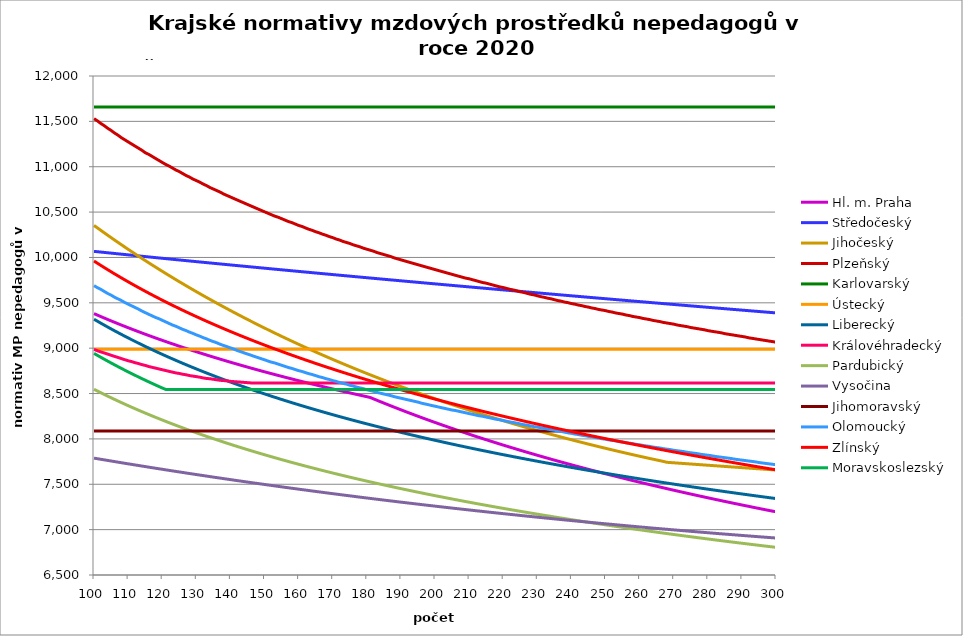
| Category | Hl. m. Praha | Středočeský | Jihočeský | Plzeňský | Karlovarský  | Ústecký   | Liberecký | Královéhradecký | Pardubický | Vysočina | Jihomoravský | Olomoucký | Zlínský | Moravskoslezský |
|---|---|---|---|---|---|---|---|---|---|---|---|---|---|---|
| 100.0 | 9380.95 | 10067.092 | 10352.976 | 11529.56 | 11657.998 | 8987.069 | 9319.242 | 8987.322 | 8546.521 | 7788.071 | 8087.211 | 9689.531 | 9960.602 | 8942.705 |
| 101.0 | 9364.603 | 10063.216 | 10325.74 | 11505.439 | 11657.998 | 8987.069 | 9297.355 | 8971.784 | 8527.436 | 7781.943 | 8087.211 | 9666.875 | 9936.397 | 8921.024 |
| 102.0 | 9348.45 | 10059.349 | 10298.725 | 11476.628 | 11657.998 | 8987.069 | 9275.775 | 8959.392 | 8508.615 | 7775.606 | 8087.211 | 9648.075 | 9912.513 | 8899.66 |
| 103.0 | 9332.488 | 10055.489 | 10271.928 | 11452.728 | 11657.998 | 8987.069 | 9254.495 | 8947.034 | 8490.052 | 7769.062 | 8087.211 | 9625.611 | 9888.94 | 8878.605 |
| 104.0 | 9316.712 | 10051.638 | 10245.346 | 11424.179 | 11657.998 | 8987.069 | 9233.508 | 8934.711 | 8471.739 | 7762.965 | 8087.211 | 9603.252 | 9865.673 | 8857.852 |
| 105.0 | 9301.118 | 10047.795 | 10218.978 | 11400.498 | 11657.998 | 8987.069 | 9212.806 | 8922.421 | 8453.671 | 7756.659 | 8087.211 | 9584.699 | 9842.703 | 8837.393 |
| 106.0 | 9285.703 | 10043.959 | 10192.822 | 11372.208 | 11657.998 | 8987.069 | 9192.382 | 8910.165 | 8435.843 | 7750.364 | 8087.211 | 9562.529 | 9820.024 | 8817.22 |
| 107.0 | 9270.462 | 10040.132 | 10166.875 | 11348.741 | 11657.998 | 8987.069 | 9172.231 | 8897.942 | 8418.248 | 7744.079 | 8087.211 | 9544.132 | 9797.628 | 8797.327 |
| 108.0 | 9255.392 | 10036.311 | 10141.134 | 11320.708 | 11657.998 | 8987.069 | 9152.345 | 8885.753 | 8400.882 | 7738.02 | 8087.211 | 9525.806 | 9775.511 | 8777.708 |
| 109.0 | 9240.489 | 10032.499 | 10115.598 | 11297.453 | 11657.998 | 8987.069 | 9132.719 | 8873.598 | 8383.739 | 7731.539 | 8087.211 | 9503.908 | 9753.664 | 8758.356 |
| 110.0 | 9225.749 | 10028.693 | 10090.266 | 11274.293 | 11657.998 | 8987.069 | 9113.346 | 8861.475 | 8366.814 | 7725.5 | 8087.211 | 9485.736 | 9732.083 | 8739.265 |
| 111.0 | 9211.169 | 10024.896 | 10065.133 | 11251.227 | 11657.998 | 8987.069 | 9094.222 | 8852.405 | 8350.102 | 7719.47 | 8087.211 | 9467.634 | 9710.761 | 8720.428 |
| 112.0 | 9196.746 | 10021.105 | 10040.2 | 11228.256 | 11657.998 | 8987.069 | 9075.339 | 8840.341 | 8333.598 | 7713.45 | 8087.211 | 9449.6 | 9689.692 | 8701.84 |
| 113.0 | 9182.477 | 10017.321 | 10015.462 | 11205.379 | 11657.998 | 8987.069 | 9056.694 | 8831.314 | 8317.298 | 7707.225 | 8087.211 | 9431.635 | 9668.872 | 8683.495 |
| 114.0 | 9168.358 | 10013.545 | 9990.92 | 11182.595 | 11657.998 | 8987.069 | 9038.28 | 8819.307 | 8301.198 | 7701.224 | 8087.211 | 9410.167 | 9648.294 | 8665.388 |
| 115.0 | 9154.386 | 10009.775 | 9966.57 | 11155.375 | 11657.998 | 8987.069 | 9020.093 | 8810.323 | 8285.293 | 7695.232 | 8087.211 | 9392.351 | 9627.953 | 8647.514 |
| 116.0 | 9140.559 | 10006.013 | 9942.41 | 11137.303 | 11657.998 | 8987.069 | 9002.128 | 8798.372 | 8269.579 | 7689.249 | 8087.211 | 9374.603 | 9607.845 | 8629.867 |
| 117.0 | 9126.873 | 10002.257 | 9918.44 | 11114.794 | 11657.998 | 8987.069 | 8984.38 | 8789.431 | 8254.051 | 7683.063 | 8087.211 | 9356.922 | 9587.964 | 8612.443 |
| 118.0 | 9113.326 | 9998.507 | 9894.656 | 11092.376 | 11657.998 | 8987.069 | 8966.844 | 8780.508 | 8238.707 | 7677.099 | 8087.211 | 9339.307 | 9568.307 | 8595.236 |
| 119.0 | 9099.915 | 9994.765 | 9871.057 | 11070.048 | 11657.998 | 8987.069 | 8949.516 | 8771.602 | 8223.541 | 7671.145 | 8087.211 | 9325.263 | 9548.867 | 8578.242 |
| 120.0 | 9086.638 | 9991.029 | 9847.642 | 11047.81 | 11657.998 | 8987.069 | 8932.392 | 8762.715 | 8208.552 | 7665.412 | 8087.211 | 9307.767 | 9529.641 | 8561.456 |
| 121.0 | 9073.491 | 9987.299 | 9824.408 | 11025.662 | 11657.998 | 8987.069 | 8915.467 | 8753.846 | 8193.733 | 7659.264 | 8087.211 | 9290.337 | 9510.625 | 8545.876 |
| 122.0 | 9060.473 | 9983.576 | 9801.353 | 11008.006 | 11657.998 | 8987.069 | 8898.737 | 8744.995 | 8179.084 | 7653.337 | 8087.211 | 9272.972 | 9491.813 | 8545.876 |
| 123.0 | 9047.581 | 9979.86 | 9778.477 | 10986.017 | 11657.998 | 8987.069 | 8882.199 | 8736.162 | 8164.599 | 7647.631 | 8087.211 | 9255.672 | 9473.203 | 8545.876 |
| 124.0 | 9034.812 | 9976.149 | 9755.776 | 10964.115 | 11657.998 | 8987.069 | 8865.848 | 8727.346 | 8150.276 | 7641.722 | 8087.211 | 9241.878 | 9454.79 | 8545.876 |
| 125.0 | 9022.165 | 9972.445 | 9733.25 | 10946.656 | 11657.998 | 8987.069 | 8849.68 | 8721.479 | 8136.111 | 7636.033 | 8087.211 | 9224.693 | 9436.57 | 8545.876 |
| 126.0 | 9009.637 | 9968.747 | 9710.896 | 10924.911 | 11657.998 | 8987.069 | 8833.693 | 8712.693 | 8122.102 | 7630.352 | 8087.211 | 9207.572 | 9418.54 | 8545.876 |
| 127.0 | 8997.226 | 9965.055 | 9688.714 | 10903.251 | 11657.998 | 8987.069 | 8817.883 | 8706.846 | 8108.245 | 7624.26 | 8087.211 | 9193.921 | 9400.696 | 8545.876 |
| 128.0 | 8984.93 | 9961.369 | 9666.701 | 10885.986 | 11657.998 | 8987.069 | 8802.245 | 8698.089 | 8094.538 | 7618.597 | 8087.211 | 9176.915 | 9383.034 | 8545.876 |
| 129.0 | 8972.747 | 9957.689 | 9644.856 | 10864.48 | 11657.998 | 8987.069 | 8786.777 | 8692.261 | 8080.977 | 7612.942 | 8087.211 | 9163.354 | 9365.55 | 8545.876 |
| 130.0 | 8960.675 | 9954.015 | 9623.177 | 10847.337 | 11657.998 | 8987.069 | 8771.476 | 8686.441 | 8067.56 | 7607.296 | 8087.211 | 9146.46 | 9348.243 | 8545.876 |
| 131.0 | 8948.711 | 9950.346 | 9601.663 | 10830.248 | 11657.998 | 8987.069 | 8756.338 | 8680.629 | 8054.283 | 7601.658 | 8087.211 | 9132.99 | 9331.107 | 8545.876 |
| 132.0 | 8936.855 | 9946.684 | 9580.311 | 10808.962 | 11657.998 | 8987.069 | 8741.36 | 8671.925 | 8041.146 | 7596.028 | 8087.211 | 9116.207 | 9314.141 | 8545.876 |
| 133.0 | 8925.103 | 9943.027 | 9559.122 | 10791.994 | 11657.998 | 8987.069 | 8726.539 | 8666.132 | 8028.144 | 7590.407 | 8087.211 | 9102.826 | 9297.34 | 8545.876 |
| 134.0 | 8913.455 | 9939.376 | 9538.092 | 10770.858 | 11657.998 | 8987.069 | 8711.873 | 8663.239 | 8015.275 | 7584.586 | 8087.211 | 9086.154 | 9280.703 | 8545.876 |
| 135.0 | 8901.909 | 9935.731 | 9517.221 | 10754.009 | 11657.998 | 8987.069 | 8697.358 | 8657.457 | 8002.538 | 7578.982 | 8087.211 | 9072.86 | 9264.225 | 8545.876 |
| 136.0 | 8890.462 | 9932.091 | 9496.507 | 10737.212 | 11657.998 | 8987.069 | 8682.991 | 8651.684 | 7989.928 | 7573.386 | 8087.211 | 9059.606 | 9247.904 | 8545.876 |
| 137.0 | 8879.113 | 9928.456 | 9475.948 | 10720.468 | 11657.998 | 8987.069 | 8668.771 | 8645.918 | 7977.446 | 7568.005 | 8087.211 | 9043.092 | 9231.738 | 8545.876 |
| 138.0 | 8867.861 | 9924.827 | 9455.544 | 10699.611 | 11657.998 | 8987.069 | 8654.694 | 8643.038 | 7965.087 | 7562.425 | 8087.211 | 9029.924 | 9215.724 | 8545.876 |
| 139.0 | 8856.704 | 9921.204 | 9435.292 | 10682.984 | 11657.998 | 8987.069 | 8640.758 | 8640.16 | 7952.85 | 7556.853 | 8087.211 | 9016.794 | 9199.858 | 8545.876 |
| 140.0 | 8845.64 | 9917.585 | 9415.192 | 10666.408 | 11657.998 | 8987.069 | 8626.96 | 8634.409 | 7940.732 | 7551.496 | 8087.211 | 9003.702 | 9184.139 | 8545.876 |
| 141.0 | 8834.668 | 9913.973 | 9395.242 | 10649.884 | 11657.998 | 8987.069 | 8613.298 | 8631.537 | 7928.732 | 7545.94 | 8087.211 | 8990.649 | 9168.563 | 8545.876 |
| 142.0 | 8823.786 | 9910.365 | 9375.44 | 10633.411 | 11657.998 | 8987.069 | 8599.77 | 8628.666 | 7916.848 | 7540.598 | 8087.211 | 8974.385 | 9153.129 | 8545.876 |
| 143.0 | 8812.994 | 9906.763 | 9355.786 | 10616.988 | 11657.998 | 8987.069 | 8586.373 | 8625.798 | 7905.077 | 7535.263 | 8087.211 | 8961.416 | 9137.834 | 8545.876 |
| 144.0 | 8802.288 | 9903.165 | 9336.278 | 10600.617 | 11657.998 | 8987.069 | 8573.104 | 8622.931 | 7893.418 | 7529.732 | 8087.211 | 8948.485 | 9122.676 | 8545.876 |
| 145.0 | 8791.669 | 9899.573 | 9316.914 | 10584.296 | 11657.998 | 8987.069 | 8559.962 | 8620.066 | 7881.868 | 7524.412 | 8087.211 | 8935.591 | 9107.652 | 8545.876 |
| 146.0 | 8781.135 | 9895.986 | 9297.694 | 10568.025 | 11657.998 | 8987.069 | 8546.945 | 8617.204 | 7870.427 | 7519.101 | 8087.211 | 8922.734 | 9092.76 | 8545.876 |
| 147.0 | 8770.684 | 9892.404 | 9278.615 | 10551.804 | 11657.998 | 8987.069 | 8534.05 | 8617.204 | 7859.091 | 7513.797 | 8087.211 | 8909.914 | 9077.998 | 8545.876 |
| 148.0 | 8760.315 | 9888.827 | 9259.678 | 10535.632 | 11657.998 | 8987.069 | 8521.276 | 8617.204 | 7847.86 | 7508.5 | 8087.211 | 8897.131 | 9063.364 | 8545.876 |
| 149.0 | 8750.027 | 9885.255 | 9240.88 | 10519.51 | 11657.998 | 8987.069 | 8508.62 | 8617.204 | 7836.731 | 7503.211 | 8087.211 | 8884.384 | 9048.856 | 8545.876 |
| 150.0 | 8739.819 | 9881.688 | 9222.22 | 10503.438 | 11657.998 | 8987.069 | 8496.081 | 8617.204 | 7825.703 | 7497.929 | 8087.211 | 8871.674 | 9034.471 | 8545.876 |
| 151.0 | 8729.689 | 9878.126 | 9203.698 | 10487.414 | 11657.998 | 8987.069 | 8483.656 | 8617.204 | 7814.775 | 7492.654 | 8087.211 | 8859 | 9020.208 | 8545.876 |
| 152.0 | 8719.636 | 9874.569 | 9185.311 | 10471.439 | 11657.998 | 8987.069 | 8471.343 | 8617.204 | 7803.944 | 7487.387 | 8087.211 | 8846.362 | 9006.065 | 8545.876 |
| 153.0 | 8709.66 | 9871.016 | 9167.06 | 10455.513 | 11657.998 | 8987.069 | 8459.142 | 8617.204 | 7793.209 | 7482.128 | 8087.211 | 8836.908 | 8992.039 | 8545.876 |
| 154.0 | 8699.758 | 9867.469 | 9148.941 | 10443.6 | 11657.998 | 8987.069 | 8447.05 | 8617.204 | 7782.569 | 7476.876 | 8087.211 | 8824.333 | 8978.13 | 8545.876 |
| 155.0 | 8689.93 | 9863.926 | 9130.956 | 10427.759 | 11657.998 | 8987.069 | 8435.064 | 8617.204 | 7772.022 | 7471.833 | 8087.211 | 8811.794 | 8964.335 | 8545.876 |
| 156.0 | 8680.175 | 9860.387 | 9113.101 | 10411.965 | 11657.998 | 8987.069 | 8423.185 | 8617.204 | 7761.567 | 7466.595 | 8087.211 | 8799.291 | 8950.653 | 8545.876 |
| 157.0 | 8670.492 | 9856.854 | 9095.377 | 10396.219 | 11657.998 | 8987.069 | 8411.41 | 8617.204 | 7751.202 | 7461.364 | 8087.211 | 8786.823 | 8937.081 | 8545.876 |
| 158.0 | 8660.879 | 9853.325 | 9077.782 | 10384.441 | 11657.998 | 8987.069 | 8399.737 | 8617.204 | 7740.925 | 7456.342 | 8087.211 | 8777.495 | 8923.618 | 8545.876 |
| 159.0 | 8651.336 | 9849.8 | 9060.314 | 10368.778 | 11657.998 | 8987.069 | 8388.164 | 8617.204 | 7730.736 | 7451.326 | 8087.211 | 8765.088 | 8910.263 | 8545.876 |
| 160.0 | 8641.862 | 9846.281 | 9042.974 | 10353.163 | 11657.998 | 8987.069 | 8376.691 | 8617.204 | 7720.634 | 7446.117 | 8087.211 | 8752.717 | 8897.013 | 8545.876 |
| 161.0 | 8632.455 | 9842.765 | 9025.759 | 10341.482 | 11657.998 | 8987.069 | 8365.316 | 8617.204 | 7710.615 | 7441.116 | 8087.211 | 8743.461 | 8883.868 | 8545.876 |
| 162.0 | 8623.115 | 9839.255 | 9008.669 | 10325.948 | 11657.998 | 8987.069 | 8354.036 | 8617.204 | 7700.681 | 7436.32 | 8087.211 | 8731.151 | 8870.825 | 8545.876 |
| 163.0 | 8613.841 | 9835.748 | 8991.703 | 10310.461 | 11657.998 | 8987.069 | 8342.852 | 8617.204 | 7690.829 | 7431.132 | 8087.211 | 8718.875 | 8857.884 | 8545.876 |
| 164.0 | 8604.631 | 9832.246 | 8974.859 | 10298.876 | 11657.998 | 8987.069 | 8331.761 | 8617.204 | 7681.057 | 7426.15 | 8087.211 | 8709.691 | 8845.042 | 8545.876 |
| 165.0 | 8595.486 | 9828.749 | 8958.137 | 10283.47 | 11657.998 | 8987.069 | 8320.761 | 8617.204 | 7671.366 | 7421.175 | 8087.211 | 8697.475 | 8832.298 | 8545.876 |
| 166.0 | 8586.404 | 9825.256 | 8941.536 | 10271.946 | 11657.998 | 8987.069 | 8309.852 | 8617.204 | 7661.753 | 7416.207 | 8087.211 | 8685.294 | 8819.651 | 8545.876 |
| 167.0 | 8577.384 | 9821.767 | 8925.055 | 10256.621 | 11657.998 | 8987.069 | 8299.033 | 8617.204 | 7652.218 | 7411.245 | 8087.211 | 8676.18 | 8807.1 | 8545.876 |
| 168.0 | 8568.425 | 9818.283 | 8908.692 | 10245.156 | 11657.998 | 8987.069 | 8288.301 | 8617.204 | 7642.759 | 7406.29 | 8087.211 | 8664.059 | 8794.642 | 8545.876 |
| 169.0 | 8559.527 | 9814.803 | 8892.446 | 10229.911 | 11657.998 | 8987.069 | 8277.656 | 8617.204 | 7633.376 | 7401.342 | 8087.211 | 8654.99 | 8782.277 | 8545.876 |
| 170.0 | 8550.689 | 9811.327 | 8876.318 | 10218.506 | 11657.998 | 8987.069 | 8267.097 | 8617.204 | 7624.067 | 7396.597 | 8087.211 | 8642.927 | 8770.004 | 8545.876 |
| 171.0 | 8541.91 | 9807.855 | 8860.305 | 10203.34 | 11657.998 | 8987.069 | 8256.621 | 8617.204 | 7614.83 | 7391.859 | 8087.211 | 8633.902 | 8757.82 | 8545.876 |
| 172.0 | 8533.188 | 9804.388 | 8844.407 | 10191.994 | 11657.998 | 8987.069 | 8246.229 | 8617.204 | 7605.666 | 7386.93 | 8087.211 | 8621.898 | 8745.726 | 8545.876 |
| 173.0 | 8524.525 | 9800.925 | 8828.623 | 10176.906 | 11657.998 | 8987.069 | 8235.918 | 8617.204 | 7596.574 | 7382.007 | 8087.211 | 8612.917 | 8733.719 | 8545.876 |
| 174.0 | 8515.917 | 9797.466 | 8812.952 | 10165.619 | 11657.998 | 8987.069 | 8225.688 | 8617.204 | 7587.551 | 7377.288 | 8087.211 | 8603.954 | 8721.798 | 8545.876 |
| 175.0 | 8507.366 | 9794.011 | 8797.393 | 10154.357 | 11657.998 | 8987.069 | 8215.537 | 8617.204 | 7578.597 | 7372.574 | 8087.211 | 8592.033 | 8709.963 | 8545.876 |
| 176.0 | 8498.87 | 9790.56 | 8781.946 | 10139.381 | 11657.998 | 8987.069 | 8205.465 | 8617.204 | 7569.712 | 7367.867 | 8087.211 | 8583.114 | 8698.211 | 8545.876 |
| 177.0 | 8490.429 | 9787.113 | 8766.608 | 10128.177 | 11657.998 | 8987.069 | 8195.47 | 8617.204 | 7560.893 | 7362.969 | 8087.211 | 8571.251 | 8686.543 | 8545.876 |
| 178.0 | 8482.041 | 9783.67 | 8751.381 | 10116.998 | 11657.998 | 8987.069 | 8185.552 | 8617.204 | 7552.141 | 7358.274 | 8087.211 | 8562.375 | 8674.956 | 8545.876 |
| 179.0 | 8473.707 | 9780.232 | 8736.261 | 10102.131 | 11657.998 | 8987.069 | 8175.708 | 8617.204 | 7543.455 | 7353.585 | 8087.211 | 8553.517 | 8663.45 | 8545.876 |
| 180.0 | 8465.424 | 9776.797 | 8721.25 | 10091.009 | 11657.998 | 8987.069 | 8165.939 | 8617.204 | 7534.833 | 7348.901 | 8087.211 | 8541.736 | 8652.024 | 8545.876 |
| 181.0 | 8456.47 | 9773.367 | 8706.345 | 10079.912 | 11657.998 | 8987.069 | 8156.242 | 8617.204 | 7526.275 | 7344.224 | 8087.211 | 8532.921 | 8640.676 | 8545.876 |
| 182.0 | 8440.899 | 9769.94 | 8691.547 | 10068.839 | 11657.998 | 8987.069 | 8146.618 | 8617.204 | 7517.779 | 7339.553 | 8087.211 | 8524.124 | 8629.406 | 8545.876 |
| 183.0 | 8425.46 | 9766.517 | 8676.853 | 10054.113 | 11657.998 | 8987.069 | 8137.065 | 8617.204 | 7509.346 | 7334.887 | 8087.211 | 8512.423 | 8618.212 | 8545.876 |
| 184.0 | 8410.151 | 9763.098 | 8662.265 | 10043.097 | 11657.998 | 8987.069 | 8127.583 | 8617.204 | 7500.973 | 7330.422 | 8087.211 | 8503.668 | 8607.094 | 8545.876 |
| 185.0 | 8394.971 | 9759.683 | 8647.779 | 10032.105 | 11657.998 | 8987.069 | 8118.169 | 8617.204 | 7492.661 | 7325.768 | 8087.211 | 8494.932 | 8596.05 | 8545.876 |
| 186.0 | 8379.917 | 9756.272 | 8633.397 | 10021.137 | 11657.998 | 8987.069 | 8108.824 | 8617.204 | 7484.409 | 7321.12 | 8087.211 | 8486.213 | 8585.08 | 8545.876 |
| 187.0 | 8364.987 | 9752.865 | 8619.117 | 10010.193 | 11657.998 | 8987.069 | 8099.547 | 8617.204 | 7476.215 | 7316.671 | 8087.211 | 8477.512 | 8574.183 | 8545.876 |
| 188.0 | 8350.18 | 9749.462 | 8604.938 | 9995.638 | 11657.998 | 8987.069 | 8090.336 | 8617.204 | 7468.08 | 7312.228 | 8087.211 | 8465.939 | 8563.357 | 8545.876 |
| 189.0 | 8335.495 | 9746.062 | 8590.859 | 9984.749 | 11657.998 | 8987.069 | 8081.191 | 8617.204 | 7460.001 | 7307.597 | 8087.211 | 8457.279 | 8552.602 | 8545.876 |
| 190.0 | 8320.928 | 9742.666 | 8576.881 | 9973.885 | 11657.998 | 8987.069 | 8072.111 | 8617.204 | 7451.98 | 7302.972 | 8087.211 | 8448.638 | 8541.918 | 8545.876 |
| 191.0 | 8306.479 | 9739.274 | 8563.001 | 9963.043 | 11657.998 | 8987.069 | 8063.095 | 8617.204 | 7444.014 | 7298.738 | 8087.211 | 8440.014 | 8531.302 | 8545.876 |
| 192.0 | 8292.146 | 9735.886 | 8549.22 | 9952.226 | 11657.998 | 8987.069 | 8054.142 | 8617.204 | 7436.103 | 7294.124 | 8087.211 | 8431.407 | 8520.754 | 8545.876 |
| 193.0 | 8277.928 | 9732.501 | 8535.536 | 9941.432 | 11657.998 | 8987.069 | 8045.252 | 8617.204 | 7428.247 | 7289.9 | 8087.211 | 8422.818 | 8510.274 | 8545.876 |
| 194.0 | 8263.822 | 9729.121 | 8521.949 | 9930.661 | 11657.998 | 8987.069 | 8036.423 | 8617.204 | 7420.444 | 7285.297 | 8087.211 | 8414.247 | 8499.861 | 8545.876 |
| 195.0 | 8249.828 | 9725.743 | 8508.458 | 9919.913 | 11657.998 | 8987.069 | 8027.656 | 8617.204 | 7412.695 | 7280.892 | 8087.211 | 8405.693 | 8489.513 | 8545.876 |
| 196.0 | 8235.943 | 9722.37 | 8495.063 | 9909.189 | 11657.998 | 8987.069 | 8018.948 | 8617.204 | 7404.998 | 7276.301 | 8087.211 | 8394.315 | 8479.23 | 8545.876 |
| 197.0 | 8222.166 | 9719 | 8481.762 | 9898.488 | 11657.998 | 8987.069 | 8010.3 | 8617.204 | 7397.353 | 7272.097 | 8087.211 | 8385.801 | 8469.011 | 8545.876 |
| 198.0 | 8208.496 | 9715.634 | 8468.555 | 9887.81 | 11657.998 | 8987.069 | 8001.711 | 8617.204 | 7389.759 | 7267.708 | 8087.211 | 8377.305 | 8458.856 | 8545.876 |
| 199.0 | 8194.931 | 9712.271 | 8455.441 | 9877.155 | 11657.998 | 8987.069 | 7993.179 | 8617.204 | 7382.216 | 7263.514 | 8087.211 | 8368.826 | 8448.763 | 8545.876 |
| 200.0 | 8181.47 | 9708.912 | 8442.421 | 9866.523 | 11657.998 | 8987.069 | 7984.705 | 8617.204 | 7374.722 | 7259.135 | 8087.211 | 8360.364 | 8438.732 | 8545.876 |
| 201.0 | 8168.111 | 9705.557 | 8429.492 | 9855.914 | 11657.998 | 8987.069 | 7976.287 | 8617.204 | 7367.278 | 7254.761 | 8087.211 | 8351.919 | 8428.762 | 8545.876 |
| 202.0 | 8154.854 | 9702.205 | 8416.654 | 9845.328 | 11657.998 | 8987.069 | 7967.925 | 8617.204 | 7359.883 | 7250.583 | 8087.211 | 8343.491 | 8418.853 | 8545.876 |
| 203.0 | 8141.696 | 9698.857 | 8403.907 | 9834.764 | 11657.998 | 8987.069 | 7959.619 | 8617.204 | 7352.535 | 7246.219 | 8087.211 | 8335.081 | 8409.003 | 8545.876 |
| 204.0 | 8128.637 | 9695.512 | 8391.251 | 9824.223 | 11657.998 | 8987.069 | 7951.366 | 8617.204 | 7345.236 | 7242.05 | 8087.211 | 8326.687 | 8399.213 | 8545.876 |
| 205.0 | 8115.675 | 9692.171 | 8378.683 | 9813.704 | 11657.998 | 8987.069 | 7943.168 | 8617.204 | 7337.983 | 7237.697 | 8087.211 | 8318.31 | 8389.481 | 8545.876 |
| 206.0 | 8102.808 | 9688.833 | 8366.204 | 9803.209 | 11657.998 | 8987.069 | 7935.023 | 8617.204 | 7330.777 | 7233.349 | 8087.211 | 8312.735 | 8379.806 | 8545.876 |
| 207.0 | 8090.037 | 9685.499 | 8353.814 | 9792.735 | 11657.998 | 8987.069 | 7926.931 | 8617.204 | 7323.617 | 7229.384 | 8087.211 | 8304.386 | 8370.189 | 8545.876 |
| 208.0 | 8077.358 | 9682.168 | 8341.511 | 9782.284 | 11657.998 | 8987.069 | 7918.89 | 8617.204 | 7316.502 | 7225.046 | 8087.211 | 8296.054 | 8360.627 | 8545.876 |
| 209.0 | 8064.772 | 9678.841 | 8329.295 | 9771.855 | 11657.998 | 8987.069 | 7910.902 | 8617.204 | 7309.432 | 7221.089 | 8087.211 | 8287.738 | 8351.122 | 8545.876 |
| 210.0 | 8052.277 | 9675.517 | 8317.165 | 9764.915 | 11657.998 | 8987.069 | 7902.963 | 8617.204 | 7302.407 | 7216.761 | 8087.211 | 8279.439 | 8341.672 | 8545.876 |
| 211.0 | 8039.872 | 9672.196 | 8305.121 | 9754.523 | 11657.998 | 8987.069 | 7895.075 | 8617.204 | 7295.425 | 7212.814 | 8087.211 | 8271.157 | 8332.276 | 8545.876 |
| 212.0 | 8027.555 | 9668.879 | 8293.162 | 9744.153 | 11657.998 | 8987.069 | 7887.237 | 8617.204 | 7288.487 | 7208.496 | 8087.211 | 8262.891 | 8322.934 | 8545.876 |
| 213.0 | 8015.327 | 9665.565 | 8281.287 | 9733.805 | 11657.998 | 8987.069 | 7879.448 | 8617.204 | 7281.591 | 7204.558 | 8087.211 | 8254.642 | 8313.645 | 8545.876 |
| 214.0 | 8003.184 | 9662.255 | 8269.496 | 9723.479 | 11657.998 | 8987.069 | 7871.707 | 8617.204 | 7274.738 | 7200.437 | 8087.211 | 8249.152 | 8304.409 | 8545.876 |
| 215.0 | 7991.128 | 9658.948 | 8257.789 | 9716.608 | 11657.998 | 8987.069 | 7864.014 | 8617.204 | 7267.927 | 7196.32 | 8087.211 | 8240.93 | 8295.225 | 8545.876 |
| 216.0 | 7979.155 | 9655.644 | 8246.165 | 9706.318 | 11657.998 | 8987.069 | 7856.369 | 8617.204 | 7261.157 | 7192.209 | 8087.211 | 8232.725 | 8286.093 | 8545.876 |
| 217.0 | 7967.266 | 9652.344 | 8234.623 | 9696.051 | 11657.998 | 8987.069 | 7848.771 | 8617.204 | 7254.428 | 7188.288 | 8087.211 | 8224.536 | 8277.012 | 8545.876 |
| 218.0 | 7955.46 | 9649.047 | 8223.162 | 9685.805 | 11657.998 | 8987.069 | 7841.219 | 8617.204 | 7247.74 | 7184.186 | 8087.211 | 8216.363 | 8267.981 | 8545.876 |
| 219.0 | 7943.734 | 9645.753 | 8211.783 | 9675.581 | 11657.998 | 8987.069 | 7833.712 | 8617.204 | 7241.092 | 7180.274 | 8087.211 | 8210.924 | 8259 | 8545.876 |
| 220.0 | 7932.089 | 9642.463 | 8200.484 | 9668.776 | 11657.998 | 8987.069 | 7826.251 | 8617.204 | 7234.483 | 7176.181 | 8087.211 | 8202.778 | 8250.068 | 8545.876 |
| 221.0 | 7920.524 | 9639.175 | 8189.266 | 9658.588 | 11657.998 | 8987.069 | 7818.835 | 8617.204 | 7227.914 | 7172.278 | 8087.211 | 8194.648 | 8241.185 | 8545.876 |
| 222.0 | 7909.037 | 9635.892 | 8178.126 | 9648.421 | 11657.998 | 8987.069 | 7811.464 | 8617.204 | 7221.383 | 7168.194 | 8087.211 | 8186.535 | 8232.35 | 8545.876 |
| 223.0 | 7897.627 | 9632.611 | 8167.066 | 9641.655 | 11657.998 | 8987.069 | 7804.136 | 8617.204 | 7214.891 | 7164.485 | 8087.211 | 8181.135 | 8223.563 | 8545.876 |
| 224.0 | 7886.294 | 9629.333 | 8156.085 | 9631.524 | 11657.998 | 8987.069 | 7796.852 | 8617.204 | 7208.437 | 7160.595 | 8087.211 | 8173.048 | 8214.824 | 8545.876 |
| 225.0 | 7875.036 | 9626.059 | 8145.181 | 9621.414 | 11657.998 | 8987.069 | 7789.61 | 8617.204 | 7202.02 | 7156.524 | 8087.211 | 8164.977 | 8206.131 | 8545.876 |
| 226.0 | 7863.854 | 9622.788 | 8134.355 | 9614.685 | 11657.998 | 8987.069 | 7782.411 | 8617.204 | 7195.641 | 7152.827 | 8087.211 | 8156.922 | 8197.485 | 8545.876 |
| 227.0 | 7852.745 | 9619.52 | 8123.606 | 9604.611 | 11657.998 | 8987.069 | 7775.254 | 8617.204 | 7189.298 | 7148.765 | 8087.211 | 8151.561 | 8188.884 | 8545.876 |
| 228.0 | 7841.709 | 9616.256 | 8112.933 | 9594.557 | 11657.998 | 8987.069 | 7768.139 | 8617.204 | 7182.991 | 7145.076 | 8087.211 | 8143.533 | 8180.329 | 8545.876 |
| 229.0 | 7830.746 | 9612.994 | 8102.337 | 9587.866 | 11657.998 | 8987.069 | 7761.065 | 8617.204 | 7176.721 | 7141.207 | 8087.211 | 8135.52 | 8171.818 | 8545.876 |
| 230.0 | 7819.854 | 9609.736 | 8091.816 | 9577.847 | 11657.998 | 8987.069 | 7754.031 | 8617.204 | 7170.486 | 7137.342 | 8087.211 | 8130.187 | 8163.352 | 8545.876 |
| 231.0 | 7809.032 | 9606.48 | 8081.37 | 9567.85 | 11657.998 | 8987.069 | 7747.038 | 8617.204 | 7164.287 | 7133.665 | 8087.211 | 8122.2 | 8154.93 | 8545.876 |
| 232.0 | 7798.28 | 9603.228 | 8070.998 | 9561.196 | 11657.998 | 8987.069 | 7740.084 | 8617.204 | 7158.122 | 7129.624 | 8087.211 | 8116.885 | 8146.552 | 8545.876 |
| 233.0 | 7787.598 | 9599.979 | 8060.701 | 9551.233 | 11657.998 | 8987.069 | 7733.17 | 8617.204 | 7151.992 | 7125.955 | 8087.211 | 8108.924 | 8138.216 | 8545.876 |
| 234.0 | 7776.983 | 9596.733 | 8050.477 | 9544.603 | 11657.998 | 8987.069 | 7726.296 | 8617.204 | 7145.895 | 7122.29 | 8087.211 | 8100.98 | 8129.923 | 8545.876 |
| 235.0 | 7766.436 | 9593.491 | 8040.326 | 9534.674 | 11657.998 | 8987.069 | 7719.459 | 8617.204 | 7139.833 | 7118.445 | 8087.211 | 8095.692 | 8121.673 | 8545.876 |
| 236.0 | 7755.955 | 9590.251 | 8030.248 | 9524.766 | 11657.998 | 8987.069 | 7712.661 | 8617.204 | 7133.804 | 7114.788 | 8087.211 | 8087.773 | 8113.464 | 8545.876 |
| 237.0 | 7745.54 | 9587.014 | 8020.242 | 9518.172 | 11657.998 | 8987.069 | 7705.901 | 8617.204 | 7127.809 | 7111.134 | 8087.211 | 8082.502 | 8105.297 | 8545.876 |
| 238.0 | 7735.19 | 9583.781 | 8010.308 | 9508.299 | 11657.998 | 8987.069 | 7699.178 | 8617.204 | 7121.846 | 7107.301 | 8087.211 | 8074.609 | 8097.17 | 8545.876 |
| 239.0 | 7724.905 | 9580.55 | 8000.446 | 9501.728 | 11657.998 | 8987.069 | 7692.492 | 8617.204 | 7115.915 | 7103.655 | 8087.211 | 8066.732 | 8089.084 | 8545.876 |
| 240.0 | 7714.684 | 9577.323 | 7990.654 | 9491.888 | 11657.998 | 8987.069 | 7685.843 | 8617.204 | 7110.017 | 7100.195 | 8087.211 | 8061.488 | 8081.039 | 8545.876 |
| 241.0 | 7704.525 | 9574.098 | 7980.933 | 9485.34 | 11657.998 | 8987.069 | 7679.23 | 8617.204 | 7104.15 | 7096.374 | 8087.211 | 8053.636 | 8073.033 | 8545.876 |
| 242.0 | 7694.429 | 9570.877 | 7971.282 | 9475.534 | 11657.998 | 8987.069 | 7672.654 | 8617.204 | 7098.315 | 7092.739 | 8087.211 | 8048.41 | 8065.066 | 8545.876 |
| 243.0 | 7684.395 | 9567.658 | 7961.701 | 9469.008 | 11657.998 | 8987.069 | 7666.112 | 8617.204 | 7092.511 | 7089.289 | 8087.211 | 8040.583 | 8057.139 | 8545.876 |
| 244.0 | 7674.421 | 9564.443 | 7952.188 | 9459.236 | 11657.998 | 8987.069 | 7659.607 | 8617.204 | 7086.738 | 7085.662 | 8087.211 | 8035.374 | 8049.25 | 8545.876 |
| 245.0 | 7664.508 | 9561.23 | 7942.745 | 9452.733 | 11657.998 | 8987.069 | 7653.136 | 8617.204 | 7080.996 | 7082.038 | 8087.211 | 8027.573 | 8041.4 | 8545.876 |
| 246.0 | 7654.655 | 9558.021 | 7933.37 | 9442.995 | 11657.998 | 8987.069 | 7646.699 | 8617.204 | 7075.284 | 7078.417 | 8087.211 | 8022.38 | 8033.587 | 8545.876 |
| 247.0 | 7644.86 | 9554.814 | 7924.063 | 9436.513 | 11657.998 | 8987.069 | 7640.297 | 8617.204 | 7069.602 | 7074.981 | 8087.211 | 8014.604 | 8025.812 | 8545.876 |
| 248.0 | 7635.124 | 9551.61 | 7914.824 | 9426.808 | 11657.998 | 8987.069 | 7633.929 | 8617.204 | 7063.949 | 7071.188 | 8087.211 | 8009.428 | 8018.074 | 8545.876 |
| 249.0 | 7625.446 | 9548.41 | 7905.652 | 9420.349 | 11657.998 | 8987.069 | 7627.594 | 8617.204 | 7058.326 | 7067.759 | 8087.211 | 8001.677 | 8010.373 | 8545.876 |
| 250.0 | 7615.825 | 9545.212 | 7896.546 | 9413.899 | 11657.998 | 8987.069 | 7621.292 | 8617.204 | 7052.733 | 7064.333 | 8087.211 | 7996.518 | 8002.709 | 8545.876 |
| 251.0 | 7606.261 | 9542.017 | 7887.508 | 9404.241 | 11657.998 | 8987.069 | 7615.024 | 8617.204 | 7047.168 | 7060.911 | 8087.211 | 7988.792 | 7995.081 | 8545.876 |
| 252.0 | 7596.753 | 9538.825 | 7878.535 | 9397.813 | 11657.998 | 8987.069 | 7608.788 | 8617.204 | 7041.631 | 7057.492 | 8087.211 | 7983.65 | 7987.488 | 8545.876 |
| 253.0 | 7587.3 | 9535.636 | 7869.627 | 9388.187 | 11657.998 | 8987.069 | 7602.584 | 8617.204 | 7036.123 | 7053.897 | 8087.211 | 7978.514 | 7979.931 | 8545.876 |
| 254.0 | 7577.902 | 9532.45 | 7860.786 | 9381.781 | 11657.998 | 8987.069 | 7596.412 | 8617.204 | 7030.643 | 7050.485 | 8087.211 | 7970.823 | 7972.409 | 8545.876 |
| 255.0 | 7568.558 | 9529.267 | 7852.009 | 9375.384 | 11657.998 | 8987.069 | 7590.272 | 8617.204 | 7025.19 | 7047.076 | 8087.211 | 7965.703 | 7964.922 | 8545.876 |
| 256.0 | 7559.268 | 9526.086 | 7843.296 | 9365.804 | 11657.998 | 8987.069 | 7584.164 | 8617.204 | 7019.766 | 7043.671 | 8087.211 | 7958.037 | 7957.47 | 8545.876 |
| 257.0 | 7550.031 | 9522.909 | 7834.648 | 9359.428 | 11657.998 | 8987.069 | 7578.086 | 8617.204 | 7014.368 | 7040.268 | 8087.211 | 7952.934 | 7950.052 | 8545.876 |
| 258.0 | 7540.846 | 9519.734 | 7826.063 | 9349.881 | 11657.998 | 8987.069 | 7572.04 | 8617.204 | 7008.997 | 7036.691 | 8087.211 | 7947.837 | 7942.668 | 8545.876 |
| 259.0 | 7531.714 | 9516.562 | 7817.543 | 9343.527 | 11657.998 | 8987.069 | 7566.023 | 8617.204 | 7003.654 | 7033.474 | 8087.211 | 7940.205 | 7935.317 | 8545.876 |
| 260.0 | 7522.634 | 9513.393 | 7809.085 | 9337.182 | 11657.998 | 8987.069 | 7560.037 | 8617.204 | 6998.336 | 7030.081 | 8087.211 | 7935.125 | 7928 | 8545.876 |
| 261.0 | 7513.604 | 9510.227 | 7800.69 | 9327.68 | 11657.998 | 8987.069 | 7554.081 | 8617.204 | 6993.045 | 7026.692 | 8087.211 | 7927.517 | 7920.715 | 8545.876 |
| 262.0 | 7504.625 | 9507.064 | 7792.357 | 9321.356 | 11657.998 | 8987.069 | 7548.155 | 8617.204 | 6987.78 | 7023.485 | 8087.211 | 7922.453 | 7913.464 | 8545.876 |
| 263.0 | 7495.696 | 9503.903 | 7784.086 | 9315.041 | 11657.998 | 8987.069 | 7542.258 | 8617.204 | 6982.541 | 7020.102 | 8087.211 | 7917.395 | 7906.244 | 8545.876 |
| 264.0 | 7486.817 | 9500.745 | 7775.877 | 9305.584 | 11657.998 | 8987.069 | 7536.39 | 8617.204 | 6977.327 | 7016.722 | 8087.211 | 7909.821 | 7899.057 | 8545.876 |
| 265.0 | 7477.986 | 9497.59 | 7767.73 | 9299.29 | 11657.998 | 8987.069 | 7530.551 | 8617.204 | 6972.139 | 7013.524 | 8087.211 | 7904.78 | 7891.902 | 8545.876 |
| 266.0 | 7469.205 | 9494.438 | 7759.644 | 9293.004 | 11657.998 | 8987.069 | 7524.741 | 8617.204 | 6966.976 | 7010.151 | 8087.211 | 7899.745 | 7884.778 | 8545.876 |
| 267.0 | 7460.471 | 9491.289 | 7751.618 | 9283.592 | 11657.998 | 8987.069 | 7518.959 | 8617.204 | 6961.838 | 7006.958 | 8087.211 | 7892.205 | 7877.686 | 8545.876 |
| 268.0 | 7451.785 | 9488.142 | 7742.195 | 9277.328 | 11657.998 | 8987.069 | 7513.205 | 8617.204 | 6956.724 | 7003.768 | 8087.211 | 7887.186 | 7870.625 | 8545.876 |
| 269.0 | 7443.146 | 9484.998 | 7739.488 | 9271.072 | 11657.998 | 8987.069 | 7507.479 | 8617.204 | 6951.635 | 7000.581 | 8087.211 | 7882.173 | 7863.594 | 8545.876 |
| 270.0 | 7434.554 | 9481.857 | 7736.785 | 9264.825 | 11657.998 | 8987.069 | 7501.78 | 8617.204 | 6946.569 | 6997.397 | 8087.211 | 7874.667 | 7856.594 | 8545.876 |
| 271.0 | 7426.008 | 9478.719 | 7734.086 | 9255.47 | 11657.998 | 8987.069 | 7496.109 | 8617.204 | 6941.528 | 6994.216 | 8087.211 | 7869.67 | 7849.624 | 8545.876 |
| 272.0 | 7417.508 | 9475.583 | 7731.389 | 9249.243 | 11657.998 | 8987.069 | 7490.465 | 8617.204 | 6936.511 | 6991.038 | 8087.211 | 7864.68 | 7842.684 | 8545.876 |
| 273.0 | 7409.053 | 9472.45 | 7728.696 | 9243.025 | 11657.998 | 8987.069 | 7484.848 | 8617.204 | 6931.518 | 6987.863 | 8087.211 | 7859.696 | 7835.774 | 8545.876 |
| 274.0 | 7400.643 | 9469.32 | 7726.006 | 9236.816 | 11657.998 | 8987.069 | 7479.257 | 8617.204 | 6926.547 | 6984.691 | 8087.211 | 7852.232 | 7828.893 | 8545.876 |
| 275.0 | 7392.278 | 9466.192 | 7723.32 | 9227.517 | 11657.998 | 8987.069 | 7473.693 | 8617.204 | 6921.6 | 6981.345 | 8087.211 | 7847.264 | 7822.042 | 8545.876 |
| 276.0 | 7383.956 | 9463.067 | 7720.636 | 9221.328 | 11657.998 | 8987.069 | 7468.155 | 8617.204 | 6916.676 | 6978.53 | 8087.211 | 7842.302 | 7815.219 | 8545.876 |
| 277.0 | 7375.679 | 9459.945 | 7717.956 | 9215.147 | 11657.998 | 8987.069 | 7462.643 | 8617.204 | 6911.775 | 6975.191 | 8087.211 | 7837.346 | 7808.425 | 8545.876 |
| 278.0 | 7367.444 | 9456.826 | 7715.279 | 9208.975 | 11657.998 | 8987.069 | 7457.157 | 8617.204 | 6906.896 | 6972.205 | 8087.211 | 7829.924 | 7801.66 | 8545.876 |
| 279.0 | 7359.253 | 9453.709 | 7712.606 | 9202.811 | 11657.998 | 8987.069 | 7451.696 | 8617.204 | 6902.039 | 6969.047 | 8087.211 | 7824.984 | 7794.923 | 8545.876 |
| 280.0 | 7351.104 | 9450.595 | 7709.935 | 9193.581 | 11657.998 | 8987.069 | 7446.261 | 8617.204 | 6897.205 | 6966.067 | 8087.211 | 7820.05 | 7788.214 | 8545.876 |
| 281.0 | 7342.997 | 9447.483 | 7707.268 | 9187.437 | 11657.998 | 8987.069 | 7440.85 | 8617.204 | 6892.393 | 6962.915 | 8087.211 | 7815.123 | 7781.533 | 8545.876 |
| 282.0 | 7334.931 | 9444.374 | 7704.604 | 9181.302 | 11657.998 | 8987.069 | 7435.465 | 8617.204 | 6887.603 | 6959.94 | 8087.211 | 7807.743 | 7774.879 | 8545.876 |
| 283.0 | 7326.907 | 9441.268 | 7701.944 | 9175.175 | 11657.998 | 8987.069 | 7430.104 | 8617.204 | 6882.834 | 6956.793 | 8087.211 | 7802.831 | 7768.253 | 8545.876 |
| 284.0 | 7318.924 | 9438.165 | 7699.286 | 9169.056 | 11657.998 | 8987.069 | 7424.767 | 8617.204 | 6878.087 | 6953.823 | 8087.211 | 7797.925 | 7761.653 | 8545.876 |
| 285.0 | 7310.982 | 9435.064 | 7696.632 | 9159.893 | 11657.998 | 8987.069 | 7419.455 | 8617.204 | 6873.361 | 6950.856 | 8087.211 | 7793.025 | 7755.081 | 8545.876 |
| 286.0 | 7303.079 | 9431.965 | 7693.981 | 9153.795 | 11657.998 | 8987.069 | 7414.167 | 8617.204 | 6868.656 | 6948.066 | 8087.211 | 7788.132 | 7748.535 | 8545.876 |
| 287.0 | 7295.217 | 9428.87 | 7691.333 | 9147.705 | 11657.998 | 8987.069 | 7408.902 | 8617.204 | 6863.972 | 6945.103 | 8087.211 | 7783.244 | 7742.016 | 8545.876 |
| 288.0 | 7287.394 | 9425.777 | 7688.688 | 9141.622 | 11657.998 | 8987.069 | 7403.661 | 8617.204 | 6859.309 | 6942.144 | 8087.211 | 7775.925 | 7735.523 | 8545.876 |
| 289.0 | 7279.61 | 9422.686 | 7686.047 | 9135.548 | 11657.998 | 8987.069 | 7398.444 | 8617.204 | 6854.666 | 6939.187 | 8087.211 | 7771.053 | 7729.056 | 8545.876 |
| 290.0 | 7271.864 | 9419.598 | 7683.409 | 9129.482 | 11657.998 | 8987.069 | 7393.25 | 8617.204 | 6850.044 | 6936.232 | 8087.211 | 7766.187 | 7722.615 | 8545.876 |
| 291.0 | 7264.157 | 9416.513 | 7680.774 | 9123.424 | 11657.998 | 8987.069 | 7388.079 | 8617.204 | 6845.442 | 6933.28 | 8087.211 | 7761.327 | 7716.199 | 8545.876 |
| 292.0 | 7256.488 | 9413.43 | 7678.142 | 9114.352 | 11657.998 | 8987.069 | 7382.93 | 8617.204 | 6840.86 | 6930.33 | 8087.211 | 7756.473 | 7709.809 | 8545.876 |
| 293.0 | 7248.857 | 9410.35 | 7675.513 | 9108.314 | 11657.998 | 8987.069 | 7377.805 | 8617.204 | 6836.298 | 6927.557 | 8087.211 | 7751.625 | 7703.444 | 8545.876 |
| 294.0 | 7241.263 | 9407.272 | 7672.888 | 9102.284 | 11657.998 | 8987.069 | 7372.701 | 8617.204 | 6831.756 | 6924.612 | 8087.211 | 7746.783 | 7697.105 | 8545.876 |
| 295.0 | 7233.707 | 9404.197 | 7670.266 | 9096.262 | 11657.998 | 8987.069 | 7367.621 | 8617.204 | 6827.233 | 6921.67 | 8087.211 | 7739.532 | 7690.79 | 8545.876 |
| 296.0 | 7226.187 | 9401.125 | 7667.647 | 9090.248 | 11657.998 | 8987.069 | 7362.562 | 8617.204 | 6822.73 | 6918.903 | 8087.211 | 7734.705 | 7684.499 | 8545.876 |
| 297.0 | 7218.703 | 9398.055 | 7665.031 | 9084.242 | 11657.998 | 8987.069 | 7357.525 | 8617.204 | 6818.246 | 6915.965 | 8087.211 | 7729.885 | 7678.233 | 8545.876 |
| 298.0 | 7211.255 | 9394.988 | 7662.418 | 9078.244 | 11657.998 | 8987.069 | 7352.51 | 8617.204 | 6813.782 | 6913.203 | 8087.211 | 7725.07 | 7671.991 | 8545.876 |
| 299.0 | 7203.844 | 9391.923 | 7659.808 | 9072.253 | 11657.998 | 8987.069 | 7347.517 | 8617.204 | 6809.336 | 6910.443 | 8087.211 | 7720.261 | 7665.774 | 8545.876 |
| 300.0 | 7196.467 | 9388.86 | 7657.202 | 9066.271 | 11657.998 | 8987.069 | 7342.544 | 8617.204 | 6804.909 | 6907.685 | 8087.211 | 7715.459 | 7659.58 | 8545.876 |